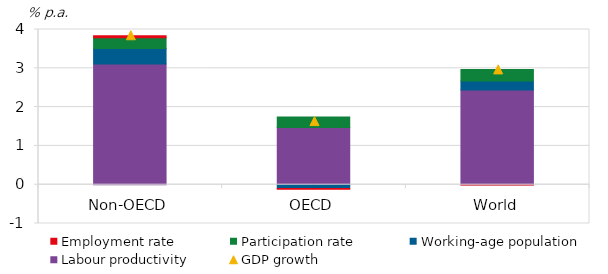
| Category | Labour productivity | Working-age population | Participation rate | Employment rate |
|---|---|---|---|---|
| Non-OECD | 3.111 | 0.398 | 0.276 | 0.055 |
| OECD | 1.474 | -0.099 | 0.273 | -0.021 |
| World | 2.444 | 0.231 | 0.291 | -0.007 |